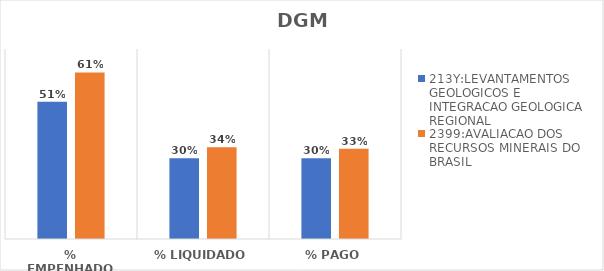
| Category | 213Y:LEVANTAMENTOS GEOLOGICOS E INTEGRACAO GEOLOGICA REGIONAL | 2399:AVALIACAO DOS RECURSOS MINERAIS DO BRASIL |
|---|---|---|
| % EMPENHADO | 0.506 | 0.614 |
| % LIQUIDADO | 0.298 | 0.338 |
| % PAGO | 0.298 | 0.332 |